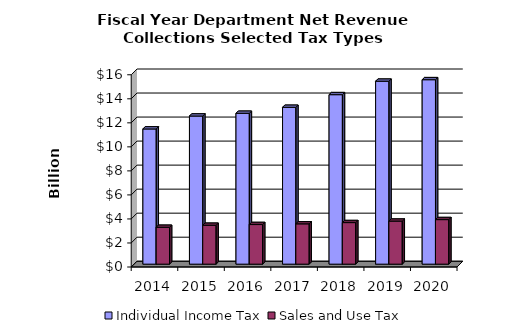
| Category | Individual Income Tax | Sales and Use Tax |
|---|---|---|
| 2014.0 | 11.253 | 3.066 |
| 2015.0 | 12.329 | 3.235 |
| 2016.0 | 12.556 | 3.296 |
| 2017.0 | 13.053 | 3.355 |
| 2018.0 | 14.106 | 3.458 |
| 2019.0 | 15.226 | 3.58 |
| 2020.0 | 15.352 | 3.707 |